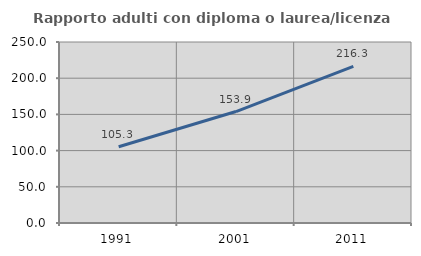
| Category | Rapporto adulti con diploma o laurea/licenza media  |
|---|---|
| 1991.0 | 105.333 |
| 2001.0 | 153.933 |
| 2011.0 | 216.25 |